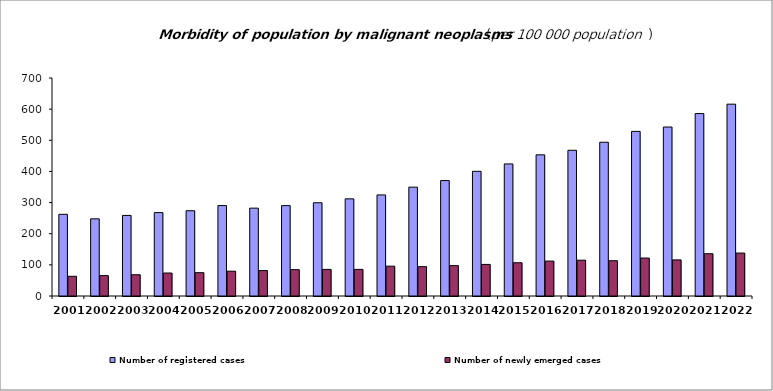
| Category | Number of registered cases           | Number of newly emerged cases                               |
|---|---|---|
| 2001.0 | 262.2 | 63.3 |
| 2002.0 | 247.8 | 65.4 |
| 2003.0 | 258.7 | 68.3 |
| 2004.0 | 267.8 | 73.8 |
| 2005.0 | 273.8 | 74.9 |
| 2006.0 | 290.3 | 79.6 |
| 2007.0 | 282.1 | 81.7 |
| 2008.0 | 290.2 | 84.6 |
| 2009.0 | 299.4 | 85.4 |
| 2010.0 | 312 | 85.4 |
| 2011.0 | 324.6 | 95.8 |
| 2012.0 | 349.537 | 94.215 |
| 2013.0 | 370.6 | 97.5 |
| 2014.0 | 400.4 | 101.4 |
| 2015.0 | 424.1 | 106.859 |
| 2016.0 | 453.3 | 112.1 |
| 2017.0 | 467.9 | 115 |
| 2018.0 | 493.7 | 113.3 |
| 2019.0 | 528.6 | 121.9 |
| 2020.0 | 542.6 | 115.9 |
| 2021.0 | 585.8 | 135.8 |
| 2022.0 | 616 | 137.9 |